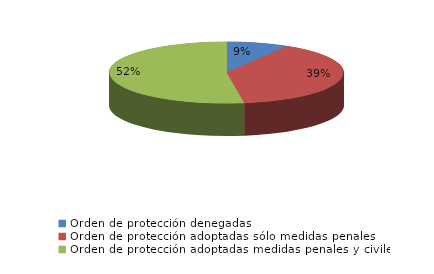
| Category | Series 0 |
|---|---|
| Orden de protección denegadas | 34 |
| Orden de protección adoptadas sólo medidas penales | 155 |
| Orden de protección adoptadas medidas penales y civiles | 208 |